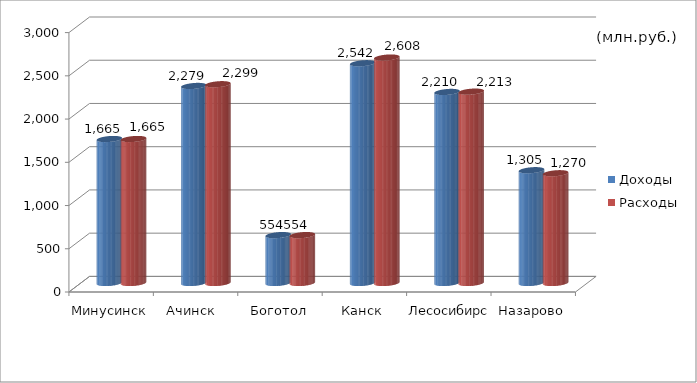
| Category | Доходы | Расходы |
|---|---|---|
| Минусинск | 1665.3 | 1665.3 |
| Ачинск  | 2278.8 | 2299 |
| Боготол | 554 | 554 |
| Канск | 2541.7 | 2607.5 |
| Лесосибирск | 2209.5 | 2213.2 |
| Назарово | 1304.5 | 1269.5 |